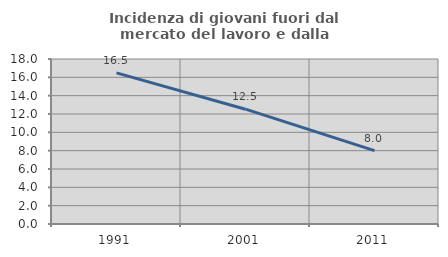
| Category | Incidenza di giovani fuori dal mercato del lavoro e dalla formazione  |
|---|---|
| 1991.0 | 16.491 |
| 2001.0 | 12.525 |
| 2011.0 | 8.009 |